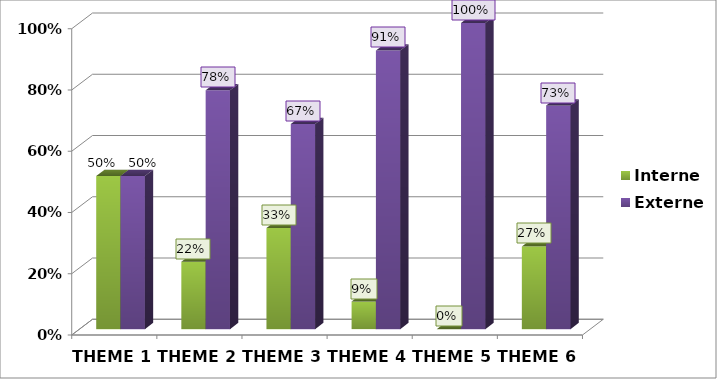
| Category | Interne | Externe |
|---|---|---|
| THEME 1 | 0.5 | 0.5 |
| THEME 2 | 0.22 | 0.78 |
| THEME 3 | 0.33 | 0.67 |
| THEME 4 | 0.09 | 0.91 |
| THEME 5 | 0 | 1 |
| THEME 6 | 0.27 | 0.73 |